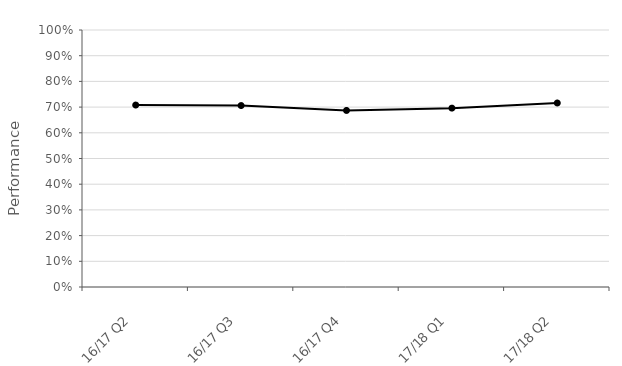
| Category | NPS South East & Eastern Division |
|---|---|
| 16/17 Q2 | 0.708 |
| 16/17 Q3 | 0.706 |
| 16/17 Q4 | 0.687 |
| 17/18 Q1 | 0.696 |
| 17/18 Q2 | 0.716 |